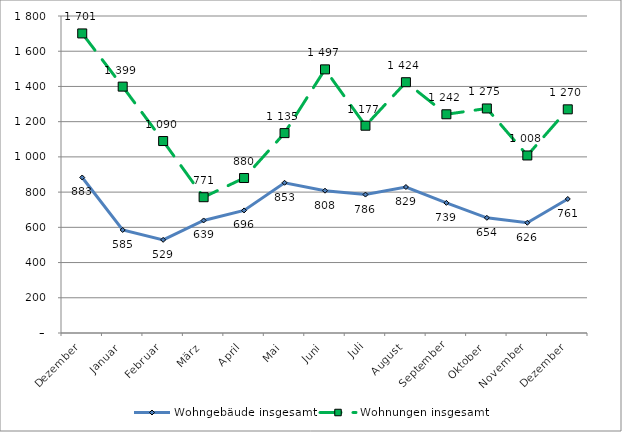
| Category | Wohngebäude insgesamt | Wohnungen insgesamt |
|---|---|---|
| Dezember | 883 | 1701 |
| Januar | 585 | 1399 |
| Februar | 529 | 1090 |
| März | 639 | 771 |
| April | 696 | 880 |
| Mai | 853 | 1135 |
| Juni | 808 | 1497 |
| Juli | 786 | 1177 |
| August | 829 | 1424 |
| September | 739 | 1242 |
| Oktober | 654 | 1275 |
| November | 626 | 1008 |
| Dezember | 761 | 1270 |